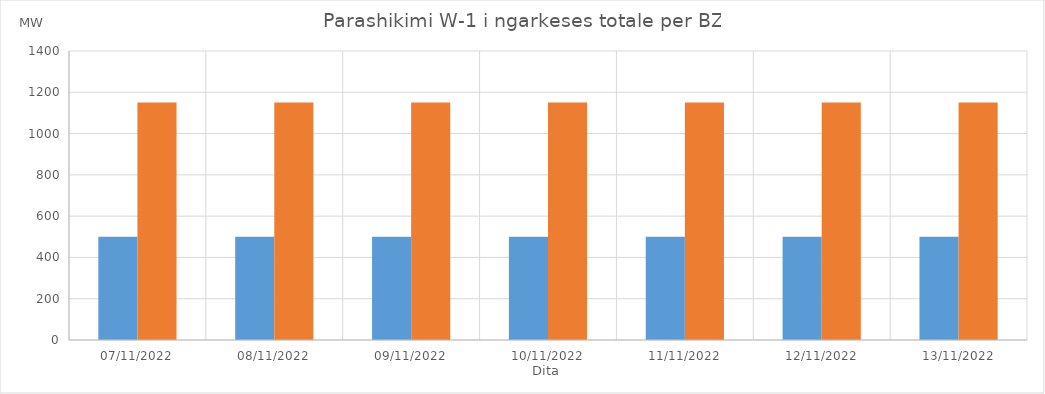
| Category | Min (MW) | Max (MW) |
|---|---|---|
| 07/11/2022 | 500 | 1150 |
| 08/11/2022 | 500 | 1150 |
| 09/11/2022 | 500 | 1150 |
| 10/11/2022 | 500 | 1150 |
| 11/11/2022 | 500 | 1150 |
| 12/11/2022 | 500 | 1150 |
| 13/11/2022 | 500 | 1150 |